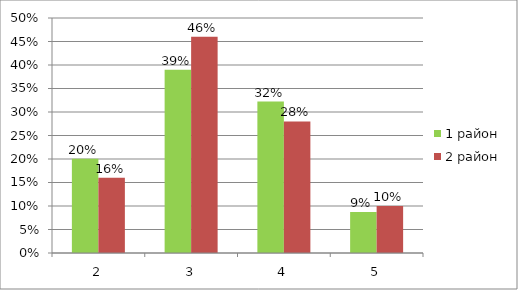
| Category | 1 район | 2 район |
|---|---|---|
| 2.0 | 0.201 | 0.16 |
| 3.0 | 0.39 | 0.46 |
| 4.0 | 0.322 | 0.28 |
| 5.0 | 0.087 | 0.1 |